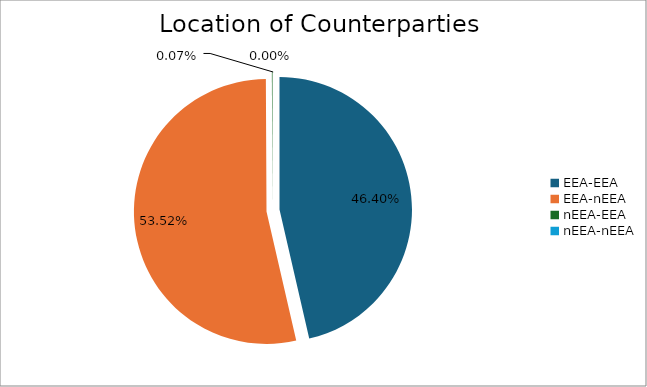
| Category | Series 0 |
|---|---|
| EEA-EEA | 6911205.626 |
| EEA-nEEA | 7972428.079 |
| nEEA-EEA | 11014.784 |
| nEEA-nEEA | 496.809 |